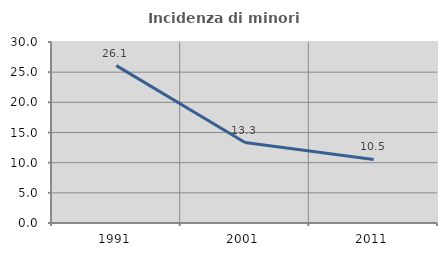
| Category | Incidenza di minori stranieri |
|---|---|
| 1991.0 | 26.087 |
| 2001.0 | 13.333 |
| 2011.0 | 10.526 |